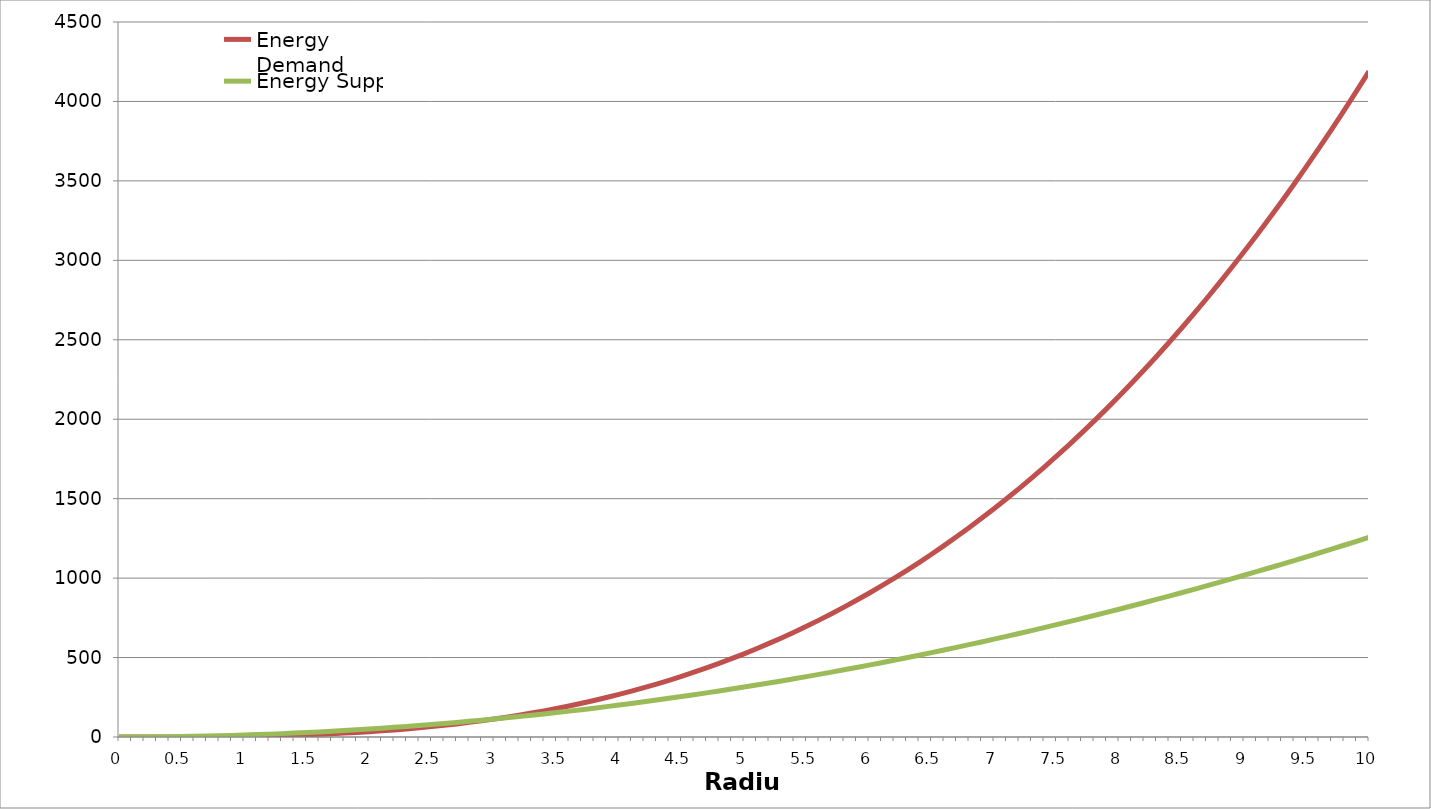
| Category | Energy Demand | Energy Supply |
|---|---|---|
| 0.0 | 0 | 0 |
| 0.1 | 0.004 | 0.126 |
| 0.2 | 0.034 | 0.503 |
| 0.3 | 0.113 | 1.131 |
| 0.4 | 0.268 | 2.011 |
| 0.5 | 0.524 | 3.142 |
| 0.6 | 0.905 | 4.524 |
| 0.7 | 1.437 | 6.158 |
| 0.8 | 2.145 | 8.042 |
| 0.9 | 3.054 | 10.179 |
| 1.0 | 4.189 | 12.566 |
| 1.1 | 5.575 | 15.205 |
| 1.2 | 7.238 | 18.096 |
| 1.3 | 9.203 | 21.237 |
| 1.4 | 11.494 | 24.63 |
| 1.5 | 14.137 | 28.274 |
| 1.6 | 17.157 | 32.17 |
| 1.7 | 20.58 | 36.317 |
| 1.8 | 24.429 | 40.715 |
| 1.9 | 28.731 | 45.365 |
| 2.0 | 33.51 | 50.265 |
| 2.1 | 38.792 | 55.418 |
| 2.2 | 44.602 | 60.821 |
| 2.3 | 50.965 | 66.476 |
| 2.4 | 57.906 | 72.382 |
| 2.5 | 65.45 | 78.54 |
| 2.6 | 73.622 | 84.949 |
| 2.7 | 82.448 | 91.609 |
| 2.8 | 91.952 | 98.52 |
| 2.9 | 102.16 | 105.683 |
| 3.0 | 113.097 | 113.097 |
| 3.1 | 124.788 | 120.763 |
| 3.2 | 137.258 | 128.68 |
| 3.3 | 150.533 | 136.848 |
| 3.4 | 164.636 | 145.267 |
| 3.5 | 179.594 | 153.938 |
| 3.6 | 195.432 | 162.86 |
| 3.7 | 212.175 | 172.034 |
| 3.8 | 229.847 | 181.458 |
| 3.9 | 248.475 | 191.134 |
| 4.0 | 268.083 | 201.062 |
| 4.1 | 288.696 | 211.241 |
| 4.2 | 310.339 | 221.671 |
| 4.3 | 333.038 | 232.352 |
| 4.4 | 356.818 | 243.285 |
| 4.5 | 381.704 | 254.469 |
| 4.6 | 407.72 | 265.904 |
| 4.7 | 434.893 | 277.591 |
| 4.8 | 463.247 | 289.529 |
| 4.9 | 492.807 | 301.719 |
| 5.0 | 523.599 | 314.159 |
| 5.1 | 555.647 | 326.851 |
| 5.2 | 588.977 | 339.795 |
| 5.3 | 623.615 | 352.989 |
| 5.4 | 659.584 | 366.435 |
| 5.5 | 696.91 | 380.133 |
| 5.6 | 735.619 | 394.081 |
| 5.7 | 775.735 | 408.281 |
| 5.8 | 817.283 | 422.733 |
| 5.9 | 860.29 | 437.435 |
| 6.0 | 904.779 | 452.389 |
| 6.1 | 950.776 | 467.595 |
| 6.2 | 998.306 | 483.051 |
| 6.3 | 1047.394 | 498.759 |
| 6.4 | 1098.066 | 514.719 |
| 6.5 | 1150.347 | 530.929 |
| 6.6 | 1204.26 | 547.391 |
| 6.7 | 1259.833 | 564.104 |
| 6.8 | 1317.09 | 581.069 |
| 6.9 | 1376.055 | 598.285 |
| 7.0 | 1436.755 | 615.752 |
| 7.1 | 1499.214 | 633.471 |
| 7.2 | 1563.458 | 651.441 |
| 7.3 | 1629.511 | 669.662 |
| 7.4 | 1697.398 | 688.134 |
| 7.5 | 1767.146 | 706.858 |
| 7.6 | 1838.778 | 725.834 |
| 7.7 | 1912.321 | 745.06 |
| 7.8 | 1987.799 | 764.538 |
| 7.9 | 2065.237 | 784.267 |
| 8.0 | 2144.661 | 804.248 |
| 8.1 | 2226.095 | 824.48 |
| 8.2 | 2309.565 | 844.963 |
| 8.3 | 2395.096 | 865.697 |
| 8.4 | 2482.713 | 886.683 |
| 8.5 | 2572.441 | 907.92 |
| 8.6 | 2664.305 | 929.409 |
| 8.7 | 2758.331 | 951.149 |
| 8.8 | 2854.543 | 973.14 |
| 8.9 | 2952.967 | 995.382 |
| 9.0 | 3053.628 | 1017.876 |
| 9.1 | 3156.551 | 1040.621 |
| 9.2 | 3261.761 | 1063.618 |
| 9.3 | 3369.283 | 1086.865 |
| 9.4 | 3479.142 | 1110.365 |
| 9.5 | 3591.364 | 1134.115 |
| 9.6 | 3705.973 | 1158.117 |
| 9.7 | 3822.996 | 1182.37 |
| 9.8 | 3942.456 | 1206.874 |
| 9.9 | 4064.379 | 1231.63 |
| 10.0 | 4188.79 | 1256.637 |